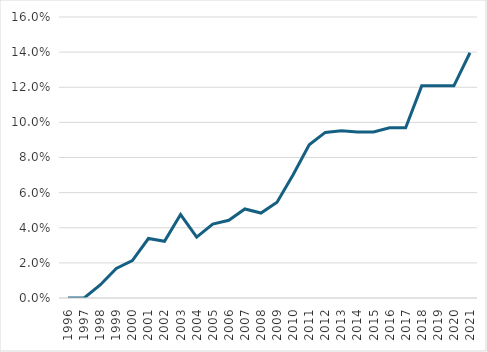
| Category | Series 0 |
|---|---|
| 1996.0 | 0 |
| 1997.0 | 0 |
| 1998.0 | 0.007 |
| 1999.0 | 0.017 |
| 2000.0 | 0.021 |
| 2001.0 | 0.034 |
| 2002.0 | 0.032 |
| 2003.0 | 0.048 |
| 2004.0 | 0.035 |
| 2005.0 | 0.042 |
| 2006.0 | 0.044 |
| 2007.0 | 0.051 |
| 2008.0 | 0.048 |
| 2009.0 | 0.055 |
| 2010.0 | 0.07 |
| 2011.0 | 0.087 |
| 2012.0 | 0.094 |
| 2013.0 | 0.095 |
| 2014.0 | 0.095 |
| 2015.0 | 0.095 |
| 2016.0 | 0.097 |
| 2017.0 | 0.097 |
| 2018.0 | 0.121 |
| 2019.0 | 0.121 |
| 2020.0 | 0.121 |
| 2021.0 | 0.14 |